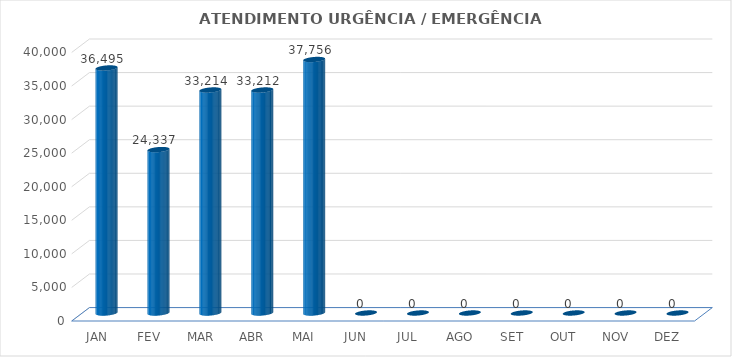
| Category | Series 0 |
|---|---|
| JAN | 36495 |
| FEV | 24337 |
| MAR | 33214 |
| ABR | 33212 |
| MAI | 37756 |
| JUN | 0 |
| JUL | 0 |
| AGO | 0 |
| SET | 0 |
| OUT | 0 |
| NOV | 0 |
| DEZ | 0 |